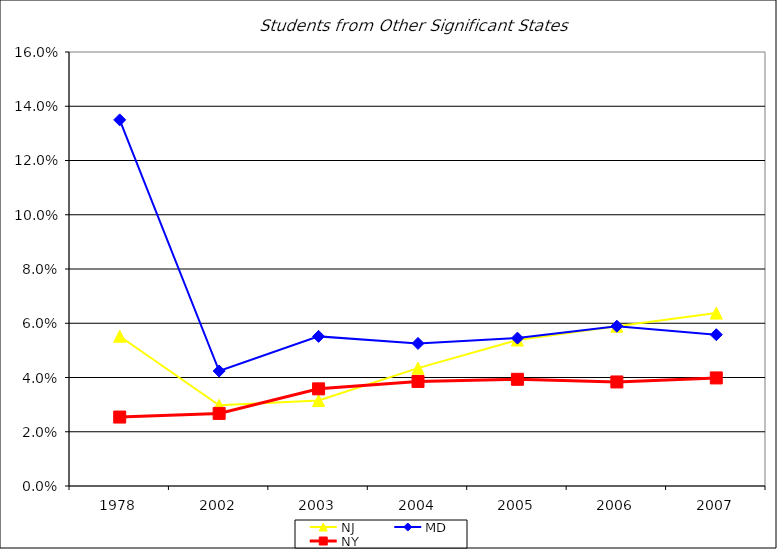
| Category | NJ | MD | NY |
|---|---|---|---|
| 1978.0 | 0.055 | 0.135 | 0.025 |
| 2002.0 | 0.03 | 0.042 | 0.027 |
| 2003.0 | 0.032 | 0.055 | 0.036 |
| 2004.0 | 0.043 | 0.053 | 0.039 |
| 2005.0 | 0.054 | 0.055 | 0.039 |
| 2006.0 | 0.059 | 0.059 | 0.038 |
| 2007.0 | 0.064 | 0.056 | 0.04 |